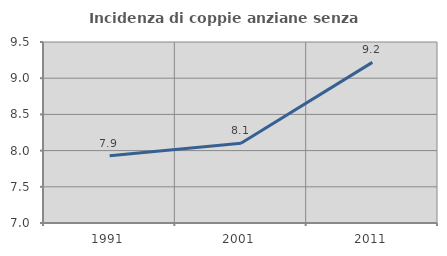
| Category | Incidenza di coppie anziane senza figli  |
|---|---|
| 1991.0 | 7.927 |
| 2001.0 | 8.102 |
| 2011.0 | 9.218 |